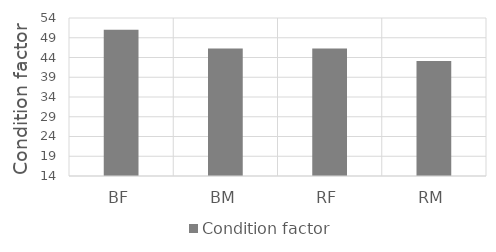
| Category | Condition factor |
|---|---|
| BF | 51 |
| BM | 46.3 |
| RF | 46.3 |
| RM | 43.1 |